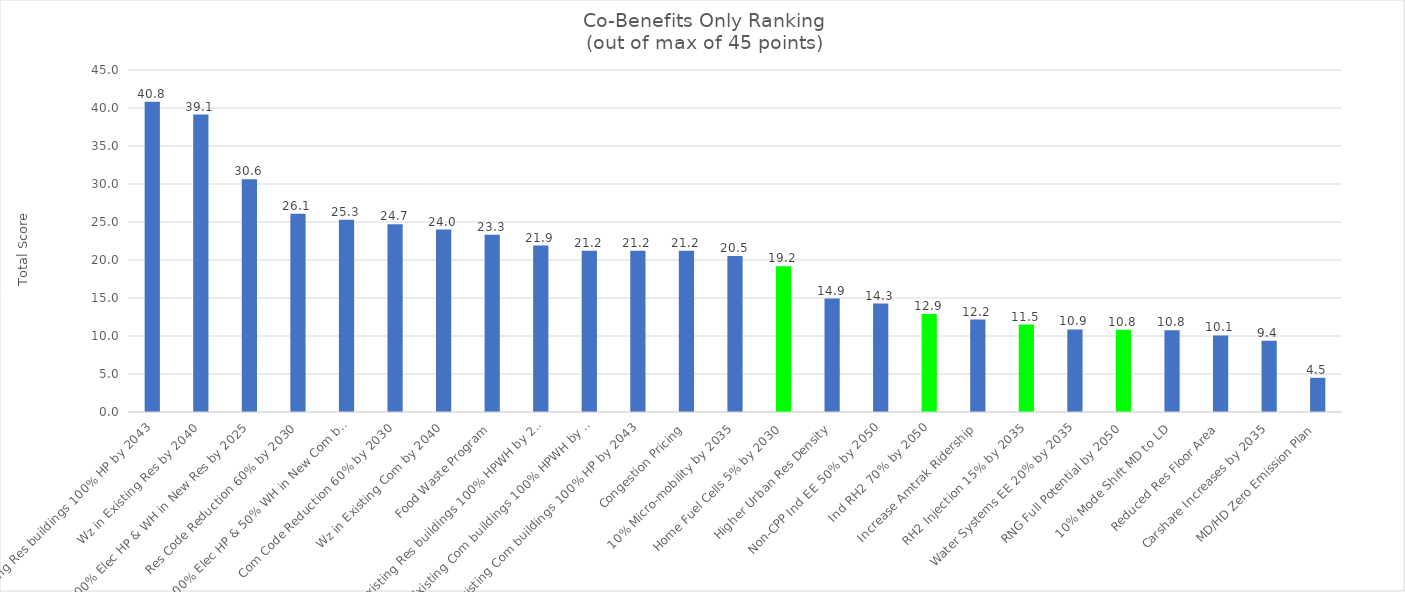
| Category | Series 0 |
|---|---|
| Existing Res buildings 100% HP by 2043 | 40.81 |
| Wz in Existing Res by 2040 | 39.14 |
| 100% Elec HP & WH in New Res by 2025 | 30.63 |
| Res Code Reduction 60% by 2030 | 26.08 |
| 100% Elec HP & 50% WH in New Com by 2025 | 25.28 |
| Com Code Reduction 60% by 2030 | 24.71 |
| Wz in Existing Com by 2040 | 24 |
| Food Waste Program | 23.31 |
| Existing Res buildings 100% HPWH by 2043 | 21.9 |
| Existing Com buildings 100% HPWH by 2043 | 21.23 |
| Existing Com buildings 100% HP by 2043 | 21.21 |
| Congestion Pricing | 21.21 |
| 10% Micro-mobility by 2035 | 20.51 |
| Home Fuel Cells 5% by 2030 | 19.18 |
| Higher Urban Res Density | 14.93 |
| Non-CPP Ind EE 50% by 2050 | 14.26 |
| Ind RH2 70% by 2050 | 12.9 |
| Increase Amtrak Ridership | 12.17 |
| RH2 Injection 15% by 2035 | 11.5 |
| Water Systems EE 20% by 2035 | 10.86 |
| RNG Full Potential by 2050 | 10.81 |
| 10% Mode Shift MD to LD | 10.77 |
| Reduced Res Floor Area | 10.08 |
| Carshare Increases by 2035 | 9.39 |
| MD/HD Zero Emission Plan | 4.5 |